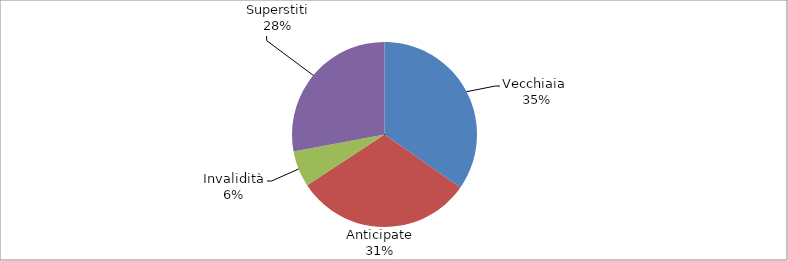
| Category | Series 0 |
|---|---|
| Vecchiaia  | 29061 |
| Anticipate | 26048 |
| Invalidità | 5270 |
| Superstiti | 23400 |